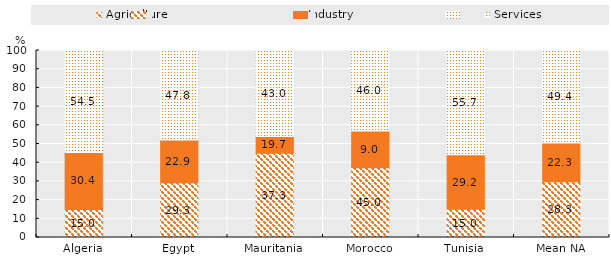
| Category | Agriculture | Industry | Services |
|---|---|---|---|
| Algeria | 15.014 | 30.447 | 54.54 |
| Egypt | 29.266 | 22.896 | 47.838 |
| Mauritania | 44.995 | 8.997 | 46 |
| Morocco | 37.278 | 19.693 | 43.029 |
| Tunisia | 15.045 | 29.244 | 55.708 |
| Mean NA | 29.758 | 20.78 | 49.459 |